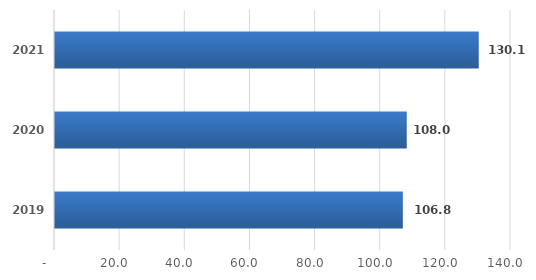
| Category | Series 0 |
|---|---|
| 2019.0 | 106.8 |
| 2020.0 | 108 |
| 2021.0 | 130.1 |